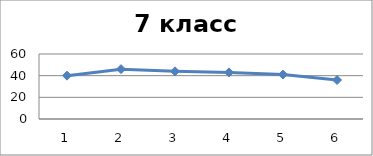
| Category | Series 0 |
|---|---|
| 0 | 40 |
| 1 | 46 |
| 2 | 44 |
| 3 | 43 |
| 4 | 41 |
| 5 | 36 |